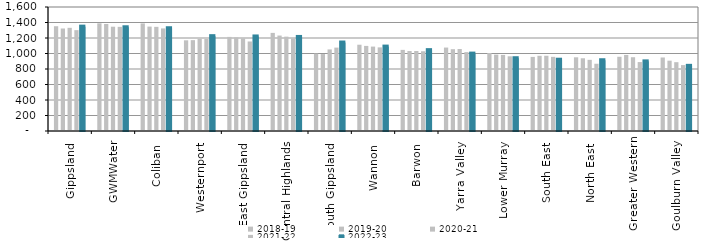
| Category | 2018-19 | 2019-20 | 2020-21 | 2021-22 | 2022-23 |
|---|---|---|---|---|---|
| Gippsland  | 1351.933 | 1322.685 | 1331.418 | 1301.419 | 1346.687 |
| GWMWater | 1389.623 | 1381.085 | 1345.694 | 1343.967 | 1338.423 |
| Coliban  | 1388.193 | 1347.154 | 1344.005 | 1323.738 | 1326.008 |
| Westernport  | 1170.176 | 1172.379 | 1189.284 | 1186.779 | 1223.709 |
| East Gippsland  | 1214.102 | 1207.088 | 1194.252 | 1155.041 | 1219.869 |
| Central Highlands  | 1265.837 | 1231.571 | 1217.305 | 1193.713 | 1213.603 |
| South Gippsland  | 998.825 | 992.918 | 1052.549 | 1076.092 | 1141.632 |
| Wannon  | 1113.35 | 1097.938 | 1089.064 | 1078.883 | 1089.14 |
| Barwon  | 1046.668 | 1031.825 | 1032.554 | 1028.843 | 1043.317 |
| Yarra Valley  | 1076.551 | 1055.611 | 1058.256 | 1017.694 | 998.699 |
| Lower Murray  | 1006.792 | 985.397 | 981.79 | 963.884 | 939.197 |
| South East  | 956.099 | 970.26 | 970.941 | 956.77 | 919.82 |
| North East  | 950.859 | 938.421 | 918.106 | 867.813 | 913.077 |
| Greater Western | 957.904 | 981.504 | 951.937 | 889.529 | 898.407 |
| Goulburn Valley  | 948.669 | 907.38 | 888.013 | 850.539 | 840.736 |